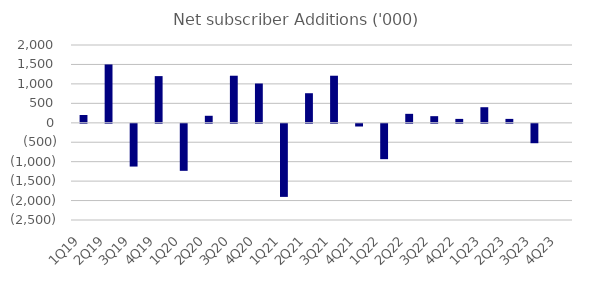
| Category | Net subscriber Additions ('000) |
|---|---|
| 1Q19 | 200 |
| 2Q19 | 1500 |
| 3Q19 | -1100 |
| 4Q19 | 1200 |
| 1Q20 | -1210 |
| 2Q20 | 180 |
| 3Q20 | 1210 |
| 4Q20 | 1010 |
| 1Q21 | -1880 |
| 2Q21 | 760 |
| 3Q21 | 1210 |
| 4Q21 | -70 |
| 1Q22 | -910 |
| 2Q22 | 230 |
| 3Q22 | 170 |
| 4Q22 | 100 |
| 1Q23 | 400 |
| 2Q23 | 100 |
| 3Q23 | -500 |
| 4Q23 | 0 |